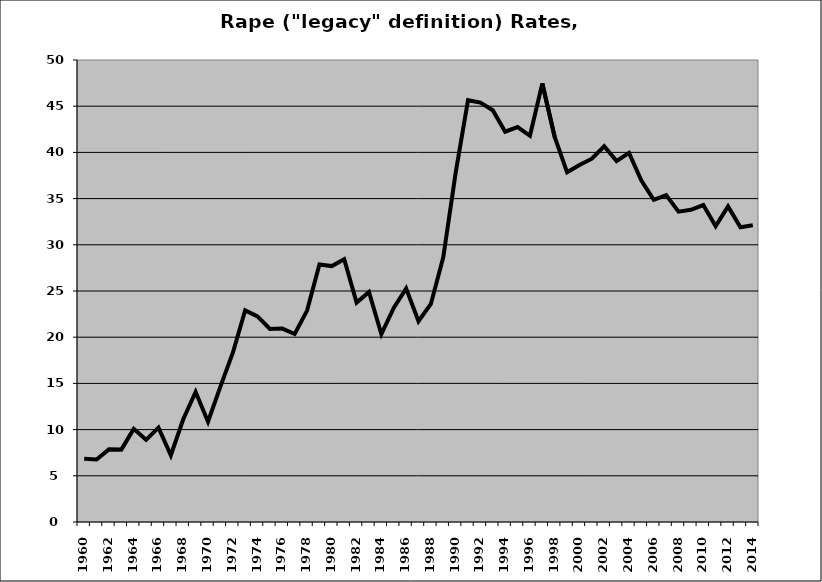
| Category | Rape |
|---|---|
| 1960.0 | 6.849 |
| 1961.0 | 6.769 |
| 1962.0 | 7.859 |
| 1963.0 | 7.833 |
| 1964.0 | 10.081 |
| 1965.0 | 8.889 |
| 1966.0 | 10.218 |
| 1967.0 | 7.227 |
| 1968.0 | 11.122 |
| 1969.0 | 14.067 |
| 1970.0 | 10.857 |
| 1971.0 | 14.65 |
| 1972.0 | 18.295 |
| 1973.0 | 22.904 |
| 1974.0 | 22.251 |
| 1975.0 | 20.896 |
| 1976.0 | 20.928 |
| 1977.0 | 20.347 |
| 1978.0 | 22.877 |
| 1979.0 | 27.871 |
| 1980.0 | 27.695 |
| 1981.0 | 28.43 |
| 1982.0 | 23.745 |
| 1983.0 | 24.892 |
| 1984.0 | 20.339 |
| 1985.0 | 23.161 |
| 1986.0 | 25.285 |
| 1987.0 | 21.726 |
| 1988.0 | 23.596 |
| 1989.0 | 28.647 |
| 1990.0 | 37.786 |
| 1991.0 | 45.65 |
| 1992.0 | 45.394 |
| 1993.0 | 44.57 |
| 1994.0 | 42.243 |
| 1995.0 | 42.747 |
| 1996.0 | 41.8 |
| 1997.0 | 47.45 |
| 1998.0 | 41.667 |
| 1999.0 | 37.843 |
| 2000.0 | 38.645 |
| 2001.0 | 39.32 |
| 2002.0 | 40.668 |
| 2003.0 | 39.071 |
| 2004.0 | 39.947 |
| 2005.0 | 36.943 |
| 2006.0 | 34.862 |
| 2007.0 | 35.383 |
| 2008.0 | 33.586 |
| 2009.0 | 33.793 |
| 2010.0 | 34.3 |
| 2011.0 | 32.015 |
| 2012.0 | 34.152 |
| 2013.0 | 31.9 |
| 2014.0 | 32.111 |